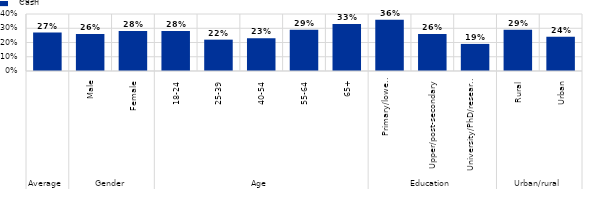
| Category | Series 0 |
|---|---|
| 0 | 0.27 |
| 1 | 0.26 |
| 2 | 0.28 |
| 3 | 0.28 |
| 4 | 0.22 |
| 5 | 0.23 |
| 6 | 0.29 |
| 7 | 0.33 |
| 8 | 0.36 |
| 9 | 0.26 |
| 10 | 0.19 |
| 11 | 0.29 |
| 12 | 0.24 |